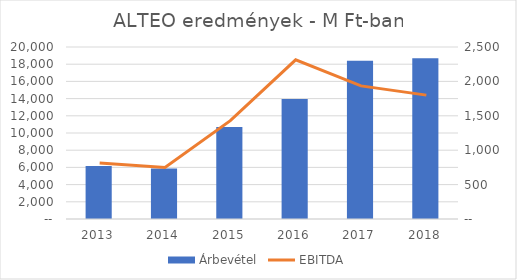
| Category | Árbevétel |
|---|---|
| 2013.0 | 6172.394 |
| 2014.0 | 5860.044 |
| 2015.0 | 10699.412 |
| 2016.0 | 13948.219 |
| 2017.0 | 18389.284 |
| 2018.0 | 18685.767 |